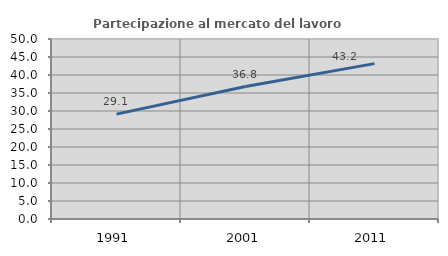
| Category | Partecipazione al mercato del lavoro  femminile |
|---|---|
| 1991.0 | 29.134 |
| 2001.0 | 36.792 |
| 2011.0 | 43.158 |